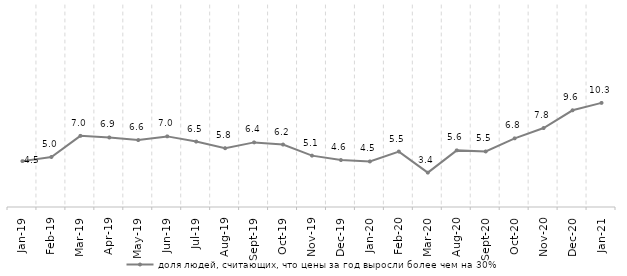
| Category | доля людей, считающих, что цены за год выросли более чем на 30% |
|---|---|
| 2019-01-01 | 4.543 |
| 2019-02-01 | 4.953 |
| 2019-03-01 | 7.044 |
| 2019-04-01 | 6.883 |
| 2019-05-01 | 6.627 |
| 2019-06-01 | 6.991 |
| 2019-07-01 | 6.476 |
| 2019-08-01 | 5.822 |
| 2019-09-01 | 6.397 |
| 2019-10-01 | 6.183 |
| 2019-11-01 | 5.085 |
| 2019-12-01 | 4.649 |
| 2020-01-01 | 4.51 |
| 2020-02-01 | 5.488 |
| 2020-03-01 | 3.403 |
| 2020-08-01 | 5.606 |
| 2020-09-01 | 5.496 |
| 2020-10-01 | 6.796 |
| 2020-11-01 | 7.818 |
| 2020-12-01 | 9.575 |
| 2021-01-01 | 10.307 |